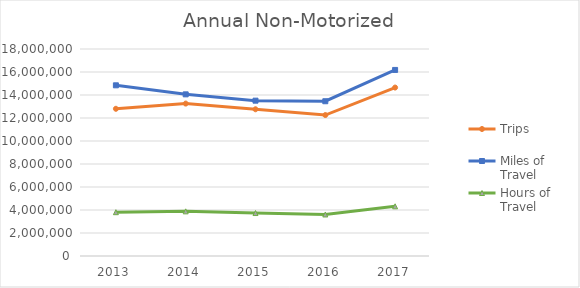
| Category | Trips | Miles of Travel | Hours of Travel |
|---|---|---|---|
| 2013 | 12801108.824 | 14842349.847 | 3809225.412 |
| 2014 | 13254301.239 | 14055925.143 | 3881845.499 |
| 2015 | 12759167.965 | 13506950.243 | 3735700.009 |
| 2016 | 12256174.985 | 13457248.886 | 3611333.822 |
| 2017 | 14647791.625 | 16179721.375 | 4320611.011 |